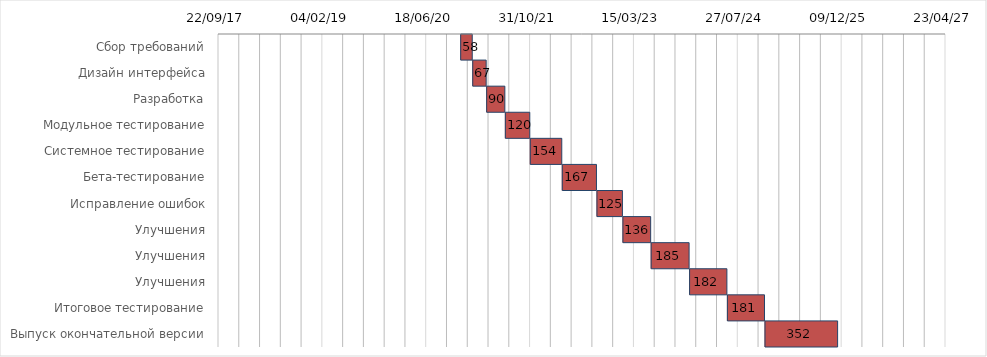
| Category | Дата начала | Длительность |
|---|---|---|
| Сбор требований | 2020-12-01 | 58 |
| Дизайн интерфейса | 2021-01-28 | 67 |
| Разработка | 2021-04-05 | 90 |
| Модульное тестирование | 2021-07-04 | 120 |
| Системное тестирование | 2021-11-01 | 154 |
| Бета-тестирование | 2022-04-04 | 167 |
| Исправление ошибок | 2022-09-18 | 125 |
| Улучшения | 2023-01-21 | 136 |
| Улучшения | 2023-06-06 | 185 |
| Улучшения | 2023-12-08 | 182 |
| Итоговое тестирование | 2024-06-07 | 181 |
| Выпуск окончательной версии | 2024-12-05 | 352 |